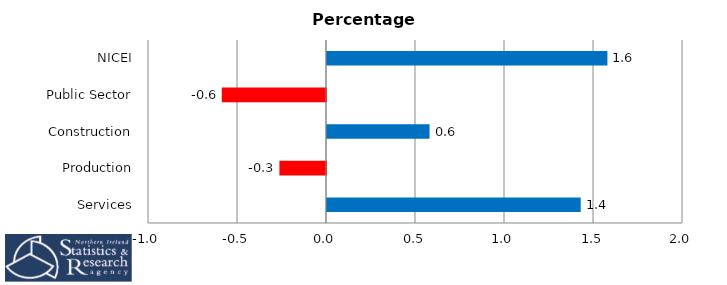
| Category | Percentage Points |
|---|---|
| Services | 1.425 |
| Production | -0.262 |
| Construction | 0.576 |
| Public Sector | -0.586 |
| NICEI | 1.575 |